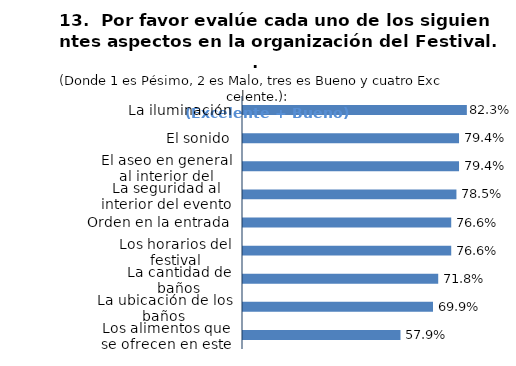
| Category | Series 0 |
|---|---|
| La iluminación | 0.823 |
| El sonido | 0.794 |
| El aseo en general al interior del evento | 0.794 |
| La seguridad al interior del evento | 0.785 |
| Orden en la entrada | 0.766 |
| Los horarios del festival | 0.766 |
| La cantidad de baños | 0.718 |
| La ubicación de los baños | 0.699 |
| Los alimentos que se ofrecen en este evento | 0.579 |